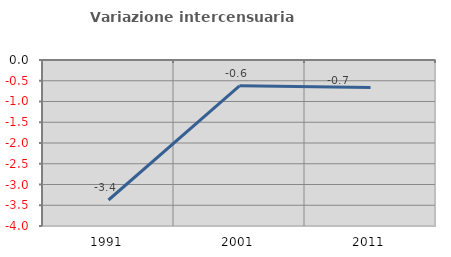
| Category | Variazione intercensuaria annua |
|---|---|
| 1991.0 | -3.373 |
| 2001.0 | -0.621 |
| 2011.0 | -0.662 |